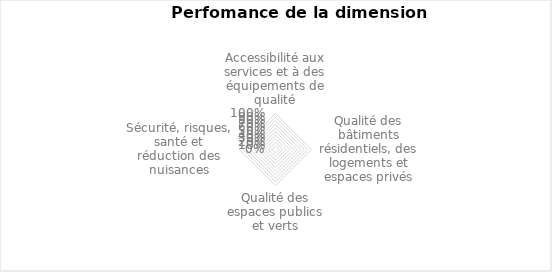
| Category | 0% |
|---|---|
| Accessibilité aux services et à des équipements de qualité | 0 |
| Qualité des bâtiments résidentiels, des logements et espaces privés | 0 |
| Qualité des espaces publics et verts | 0 |
| Sécurité, risques, santé et réduction des nuisances | 0 |